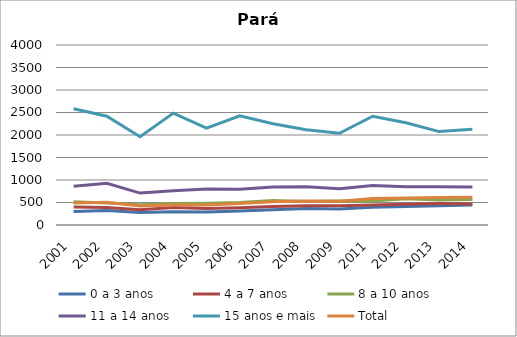
| Category | 0 a 3 anos | 4 a 7 anos | 8 a 10 anos | 11 a 14 anos | 15 anos e mais | Total |
|---|---|---|---|---|---|---|
| 2001.0 | 301.4 | 398.1 | 517.2 | 858.5 | 2584.5 | 488.9 |
| 2002.0 | 321.7 | 387.1 | 490.4 | 928.5 | 2416.7 | 507.3 |
| 2003.0 | 276.5 | 337.7 | 451.7 | 709.6 | 1961.8 | 423.5 |
| 2004.0 | 295.1 | 388 | 476.8 | 763.5 | 2485.8 | 446.2 |
| 2005.0 | 286.4 | 364.4 | 482.5 | 800.7 | 2151.6 | 441.9 |
| 2006.0 | 312.5 | 381.7 | 501.3 | 797 | 2428.3 | 475.1 |
| 2007.0 | 340.5 | 411.2 | 543 | 842.5 | 2248.5 | 517.7 |
| 2008.0 | 368.1 | 430.1 | 521.9 | 850.3 | 2115.8 | 535 |
| 2009.0 | 355.2 | 430.3 | 532.3 | 804.2 | 2037.6 | 525.5 |
| 2011.0 | 395.2 | 446.5 | 534 | 879.4 | 2415.9 | 589.6 |
| 2012.0 | 411 | 460.9 | 585.5 | 849.6 | 2270.5 | 601.8 |
| 2013.0 | 427.9 | 480.5 | 555.1 | 850.6 | 2076 | 613.3 |
| 2014.0 | 443.5 | 467.3 | 568.8 | 846.6 | 2127.7 | 618.4 |